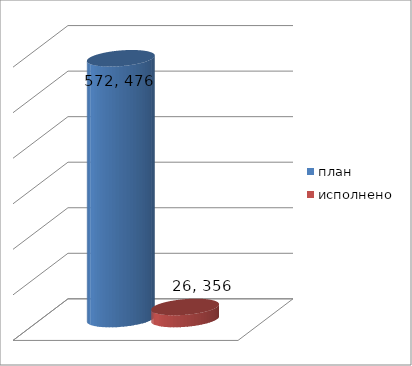
| Category | план | исполнено |
|---|---|---|
| 0 | 572476700 | 26356837.24 |